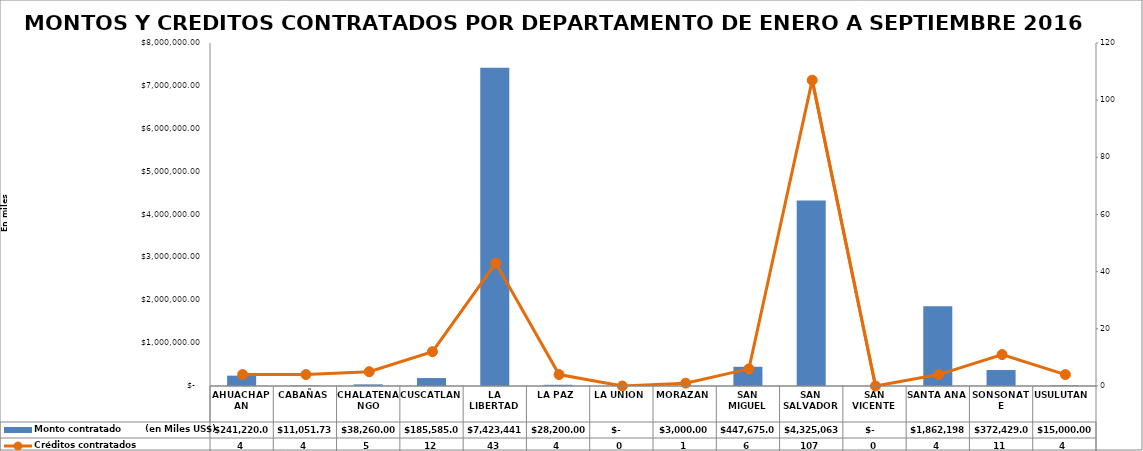
| Category | Monto contratado        (en Miles US$) |
|---|---|
| AHUACHAPAN | 241220 |
| CABAÑAS | 11051.73 |
| CHALATENANGO | 38260 |
| CUSCATLAN | 185585 |
| LA LIBERTAD | 7423441.52 |
| LA PAZ | 28200 |
| LA UNION | 0 |
| MORAZAN | 3000 |
| SAN MIGUEL | 447675 |
| SAN SALVADOR | 4325063.37 |
| SAN VICENTE | 0 |
| SANTA ANA | 1862198 |
| SONSONATE | 372429 |
| USULUTAN | 15000 |